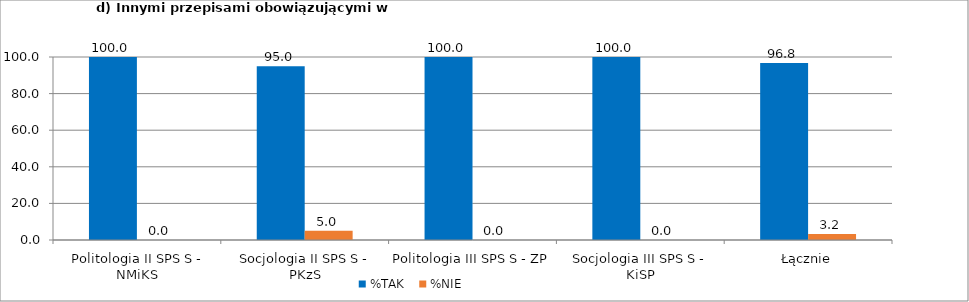
| Category | %TAK | %NIE |
|---|---|---|
| Politologia II SPS S - NMiKS | 100 | 0 |
| Socjologia II SPS S - PKzS | 95 | 5 |
| Politologia III SPS S - ZP | 100 | 0 |
| Socjologia III SPS S - KiSP | 100 | 0 |
| Łącznie | 96.774 | 3.226 |